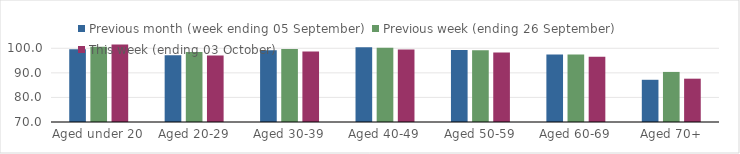
| Category | Previous month (week ending 05 September) | Previous week (ending 26 September) | This week (ending 03 October) |
|---|---|---|---|
| Aged under 20 | 99.64 | 100.66 | 101.58 |
| Aged 20-29 | 97.19 | 98.46 | 97.1 |
| Aged 30-39 | 99.16 | 99.7 | 98.71 |
| Aged 40-49 | 100.43 | 100.24 | 99.47 |
| Aged 50-59 | 99.34 | 99.21 | 98.27 |
| Aged 60-69 | 97.44 | 97.44 | 96.54 |
| Aged 70+ | 87.18 | 90.38 | 87.63 |